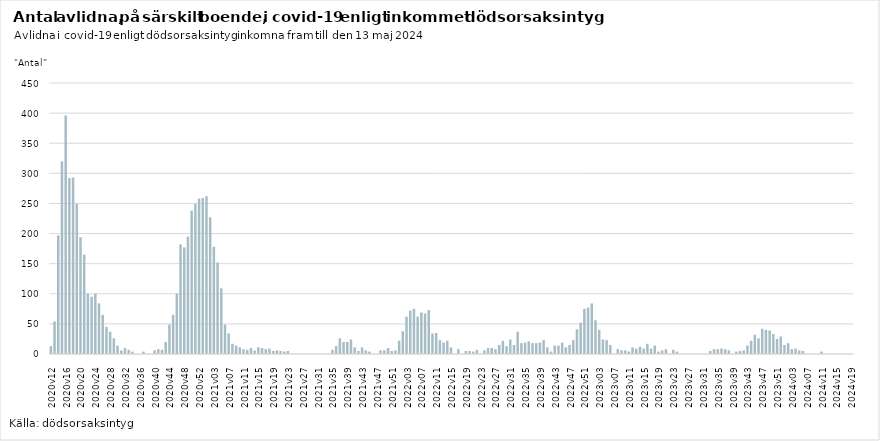
| Category | Series 0 |
|---|---|
| 2020v12 | 13 |
| 2020v13 | 54 |
| 2020v14 | 197 |
| 2020v15 | 320 |
| 2020v16 | 396 |
| 2020v17 | 292 |
| 2020v18 | 293 |
| 2020v19 | 249 |
| 2020v20 | 194 |
| 2020v21 | 165 |
| 2020v22 | 100 |
| 2020v23 | 95 |
| 2020v24 | 100 |
| 2020v25 | 84 |
| 2020v26 | 65 |
| 2020v27 | 45 |
| 2020v28 | 37 |
| 2020v29 | 26 |
| 2020v30 | 14 |
| 2020v31 | 6 |
| 2020v32 | 10 |
| 2020v33 | 7 |
| 2020v34 | 4 |
| 2020v35 | 0 |
| 2020v36 | 0 |
| 2020v37 | 4 |
| 2020v38 | 0 |
| 2020v39 | 0 |
| 2020v40 | 6 |
| 2020v41 | 8 |
| 2020v42 | 7 |
| 2020v43 | 20 |
| 2020v44 | 49 |
| 2020v45 | 65 |
| 2020v46 | 100 |
| 2020v47 | 182 |
| 2020v48 | 177 |
| 2020v49 | 195 |
| 2020v50 | 238 |
| 2020v51 | 249 |
| 2020v52 | 258 |
| 2020v53 | 259 |
| 2021v01 | 262 |
| 2021v02 | 227 |
| 2021v03 | 178 |
| 2021v04 | 152 |
| 2021v05 | 109 |
| 2021v06 | 49 |
| 2021v07 | 34 |
| 2021v08 | 17 |
| 2021v09 | 14 |
| 2021v10 | 11 |
| 2021v11 | 8 |
| 2021v12 | 7 |
| 2021v13 | 10 |
| 2021v14 | 6 |
| 2021v15 | 11 |
| 2021v16 | 10 |
| 2021v17 | 8 |
| 2021v18 | 9 |
| 2021v19 | 5 |
| 2021v20 | 6 |
| 2021v21 | 5 |
| 2021v22 | 4 |
| 2021v23 | 5 |
| 2021v24 | 0 |
| 2021v25 | 0 |
| 2021v26 | 0 |
| 2021v27 | 0 |
| 2021v28 | 0 |
| 2021v29 | 0 |
| 2021v30 | 0 |
| 2021v31 | 0 |
| 2021v32 | 0 |
| 2021v33 | 0 |
| 2021v34 | 0 |
| 2021v35 | 7 |
| 2021v36 | 13 |
| 2021v37 | 26 |
| 2021v38 | 20 |
| 2021v39 | 20 |
| 2021v40 | 24 |
| 2021v41 | 11 |
| 2021v42 | 5 |
| 2021v43 | 11 |
| 2021v44 | 6 |
| 2021v45 | 4 |
| 2021v46 | 0 |
| 2021v47 | 0 |
| 2021v48 | 6 |
| 2021v49 | 6 |
| 2021v50 | 10 |
| 2021v51 | 5 |
| 2021v52 | 6 |
| 2022v01 | 22 |
| 2022v02 | 38 |
| 2022v03 | 62 |
| 2022v04 | 72 |
| 2022v05 | 75 |
| 2022v06 | 62 |
| 2022v07 | 69 |
| 2022v08 | 67 |
| 2022v09 | 73 |
| 2022v10 | 34 |
| 2022v11 | 35 |
| 2022v12 | 23 |
| 2022v13 | 19 |
| 2022v14 | 22 |
| 2022v15 | 11 |
| 2022v16 | 0 |
| 2022v17 | 8 |
| 2022v18 | 0 |
| 2022v19 | 5 |
| 2022v20 | 5 |
| 2022v21 | 4 |
| 2022v22 | 7 |
| 2022v23 | 0 |
| 2022v24 | 6 |
| 2022v25 | 10 |
| 2022v26 | 10 |
| 2022v27 | 8 |
| 2022v28 | 15 |
| 2022v29 | 22 |
| 2022v30 | 13 |
| 2022v31 | 24 |
| 2022v32 | 15 |
| 2022v33 | 37 |
| 2022v34 | 18 |
| 2022v35 | 19 |
| 2022v36 | 21 |
| 2022v37 | 18 |
| 2022v38 | 18 |
| 2022v39 | 19 |
| 2022v40 | 23 |
| 2022v41 | 11 |
| 2022v42 | 4 |
| 2022v43 | 14 |
| 2022v44 | 14 |
| 2022v45 | 19 |
| 2022v46 | 11 |
| 2022v47 | 15 |
| 2022v48 | 23 |
| 2022v49 | 41 |
| 2022v50 | 52 |
| 2022v51 | 75 |
| 2022v52 | 77 |
| 2023v01 | 84 |
| 2023v02 | 56 |
| 2023v03 | 40 |
| 2023v04 | 24 |
| 2023v05 | 23 |
| 2023v06 | 15 |
| 2023v07 | 0 |
| 2023v08 | 8 |
| 2023v09 | 6 |
| 2023v10 | 6 |
| 2023v11 | 4 |
| 2023v12 | 11 |
| 2023v13 | 9 |
| 2023v14 | 12 |
| 2023v15 | 9 |
| 2023v16 | 17 |
| 2023v17 | 9 |
| 2023v18 | 14 |
| 2023v19 | 4 |
| 2023v20 | 6 |
| 2023v21 | 8 |
| 2023v22 | 0 |
| 2023v23 | 7 |
| 2023v24 | 4 |
| 2023v25 | 0 |
| 2023v26 | 0 |
| 2023v27 | 0 |
| 2023v28 | 0 |
| 2023v29 | 0 |
| 2023v30 | 0 |
| 2023v31 | 0 |
| 2023v32 | 0 |
| 2023v33 | 5 |
| 2023v34 | 8 |
| 2023v35 | 8 |
| 2023v36 | 9 |
| 2023v37 | 8 |
| 2023v38 | 6 |
| 2023v39 | 0 |
| 2023v40 | 4 |
| 2023v41 | 5 |
| 2023v42 | 6 |
| 2023v43 | 14 |
| 2023v44 | 22 |
| 2023v45 | 32 |
| 2023v46 | 26 |
| 2023v47 | 42 |
| 2023v48 | 40 |
| 2023v49 | 39 |
| 2023v50 | 33 |
| 2023v51 | 25 |
| 2023v52 | 29 |
| 2024v01 | 15 |
| 2024v02 | 18 |
| 2024v03 | 8 |
| 2024v04 | 9 |
| 2024v05 | 6 |
| 2024v06 | 5 |
| 2024v07 | 0 |
| 2024v08 | 0 |
| 2024v09 | 0 |
| 2024v10 | 0 |
| 2024v11 | 4 |
| 2024v12 | 0 |
| 2024v13 | 0 |
| 2024v14 | 0 |
| 2024v15 | 0 |
| 2024v16 | 0 |
| 2024v17 | 0 |
| 2024v18 | 0 |
| 2024v19 | 0 |